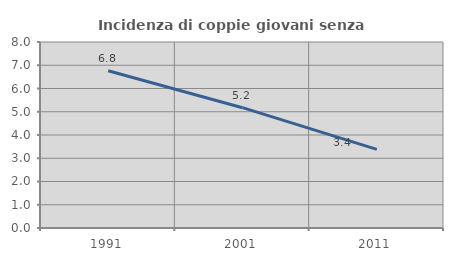
| Category | Incidenza di coppie giovani senza figli |
|---|---|
| 1991.0 | 6.762 |
| 2001.0 | 5.175 |
| 2011.0 | 3.382 |